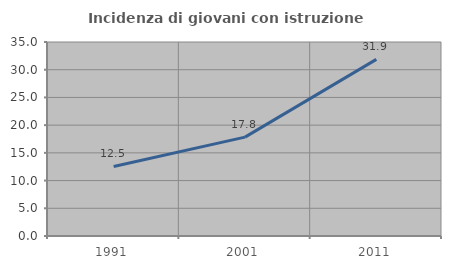
| Category | Incidenza di giovani con istruzione universitaria |
|---|---|
| 1991.0 | 12.544 |
| 2001.0 | 17.843 |
| 2011.0 | 31.863 |